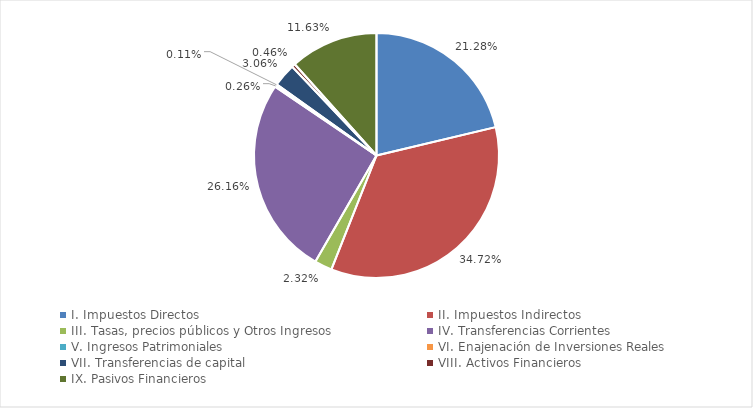
| Category | Series 0 |
|---|---|
| I. Impuestos Directos | 0.213 |
| II. Impuestos Indirectos | 0.347 |
| III. Tasas, precios públicos y Otros Ingresos | 0.023 |
| IV. Transferencias Corrientes | 0.262 |
| V. Ingresos Patrimoniales | 0.003 |
| VI. Enajenación de Inversiones Reales | 0.001 |
| VII. Transferencias de capital | 0.031 |
| VIII. Activos Financieros | 0.005 |
| IX. Pasivos Financieros | 0.116 |